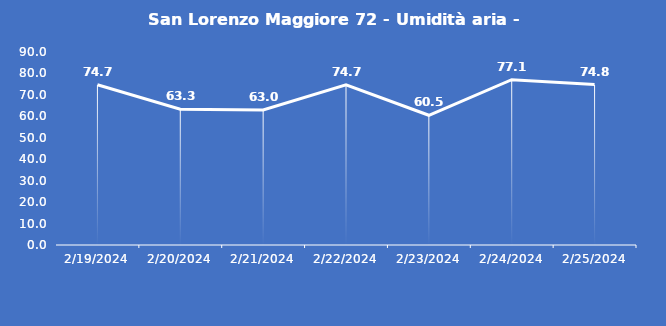
| Category | San Lorenzo Maggiore 72 - Umidità aria - Grezzo (%) |
|---|---|
| 2/19/24 | 74.7 |
| 2/20/24 | 63.3 |
| 2/21/24 | 63 |
| 2/22/24 | 74.7 |
| 2/23/24 | 60.5 |
| 2/24/24 | 77.1 |
| 2/25/24 | 74.8 |